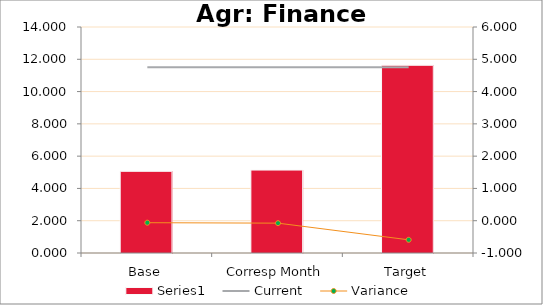
| Category | Series 0 |
|---|---|
| Base | 5.06 |
| Corresp Month | 5.138 |
| Target | 11.629 |